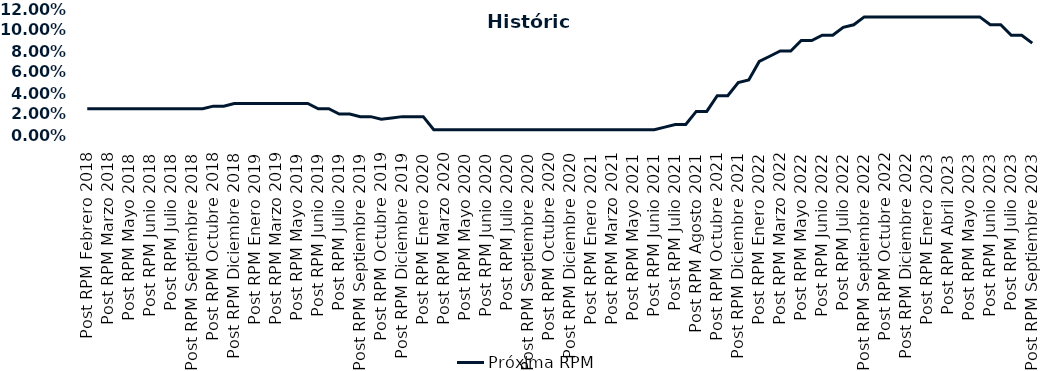
| Category | Próxima RPM |
|---|---|
| Post RPM Febrero 2018 | 0.025 |
| Pre RPM Marzo 2018 | 0.025 |
| Post RPM Marzo 2018 | 0.025 |
| Pre RPM Mayo 2018 | 0.025 |
| Post RPM Mayo 2018 | 0.025 |
| Pre RPM Junio 2018 | 0.025 |
| Post RPM Junio 2018 | 0.025 |
| Pre RPM Julio 2018 | 0.025 |
| Post RPM Julio 2018 | 0.025 |
| Pre RPM Septiembre 2018 | 0.025 |
| Post RPM Septiembre 2018 | 0.025 |
| Pre RPM Octubre 2018 | 0.025 |
| Post RPM Octubre 2018 | 0.028 |
| Pre RPM Diciembre 2018 | 0.028 |
| Post RPM Diciembre 2018 | 0.03 |
| Pre RPM Enero 2019 | 0.03 |
| Post RPM Enero 2019 | 0.03 |
| Pre RPM Marzo 2019 | 0.03 |
| Post RPM Marzo 2019 | 0.03 |
| Pre RPM Mayo 2019 | 0.03 |
| Post RPM Mayo 2019 | 0.03 |
| Pre RPM Junio 2019 | 0.03 |
| Post RPM Junio 2019 | 0.025 |
| Pre RPM Julio 2019 | 0.025 |
| Post RPM Julio 2019 | 0.02 |
| Pre RPM Septiembre 2019 | 0.02 |
| Post RPM Septiembre 2019 | 0.018 |
| Pre RPM Octubre 2019 | 0.018 |
| Post RPM Octubre 2019 | 0.015 |
| Pre RPM Diciembre 2019 | 0.016 |
| Post RPM Diciembre 2019 | 0.018 |
| Pre RPM Enero 2020 | 0.018 |
| Post RPM Enero 2020 | 0.018 |
| Pre RPM Marzo 2020 | 0.005 |
| Post RPM Marzo 2020 | 0.005 |
| Pre RPM Mayo 2020 | 0.005 |
| Post RPM Mayo 2020 | 0.005 |
| Pre RPM Junio 2020 | 0.005 |
| Post RPM Junio 2020 | 0.005 |
| Pre RPM Julio 2020 | 0.005 |
| Post RPM Julio 2020 | 0.005 |
| Pre RPM Septiembre 2020 | 0.005 |
| Post RPM Septiembre 2020 | 0.005 |
| Pre RPM Octubre 2020 | 0.005 |
| Post RPM Octubre 2020 | 0.005 |
| Pre RPM Diciembre 2020 | 0.005 |
| Post RPM Diciembre 2020 | 0.005 |
| Pre RPM Enero 2021 | 0.005 |
| Post RPM Enero 2021 | 0.005 |
| Pre RPM Marzo 2021 | 0.005 |
| Post RPM Marzo 2021 | 0.005 |
| Pre RPM Mayo 2021 | 0.005 |
| Post RPM Mayo 2021 | 0.005 |
| Pre RPM Junio 2021 | 0.005 |
| Post RPM Junio 2021 | 0.005 |
| Pre RPM Julio 2021 | 0.008 |
| Post RPM Julio 2021 | 0.01 |
| Pre RPM Agosto 2021 | 0.01 |
| Post RPM Agosto 2021 | 0.022 |
| Pre RPM Octubre 2021 | 0.022 |
| Post RPM Octubre 2021 | 0.038 |
| Pre RPM Diciembre 2021 | 0.038 |
| Post RPM Diciembre 2021 | 0.05 |
| Pre RPM Enero 2022 | 0.052 |
| Post RPM Enero 2022 | 0.07 |
| Pre RPM Marzo 2022 | 0.075 |
| Post RPM Marzo 2022 | 0.08 |
| Pre RPM Mayo 2022 | 0.08 |
| Post RPM Mayo 2022 | 0.09 |
| Pre RPM Junio 2022 | 0.09 |
| Post RPM Junio 2022 | 0.095 |
| Pre RPM Julio 2022 | 0.095 |
| Post RPM Julio 2022 | 0.102 |
| Pre RPM Septiembre 2022 | 0.105 |
| Post RPM Septiembre 2022 | 0.112 |
| Pre RPM Octubre 2022 | 0.112 |
| Post RPM Octubre 2022 | 0.112 |
| Pre RPM Diciembre 2022 | 0.112 |
| Post RPM Diciembre 2022 | 0.112 |
| Pre RPM Enero 2023 | 0.112 |
| Post RPM Enero 2023 | 0.112 |
| Pre RPM Abril 2023 | 0.112 |
| Post RPM Abril 2023 | 0.112 |
| Pre RPM Mayo 2023 | 0.112 |
| Post RPM Mayo 2023 | 0.112 |
| Pre RPM Junio 2023 | 0.112 |
| Post RPM Junio 2023 | 0.105 |
| Pre RPM Julio 2023 | 0.105 |
| Post RPM Julio 2023 | 0.095 |
| Pre RPM Septiembre 2023 | 0.095 |
| Post RPM Septiembre 2023 | 0.088 |